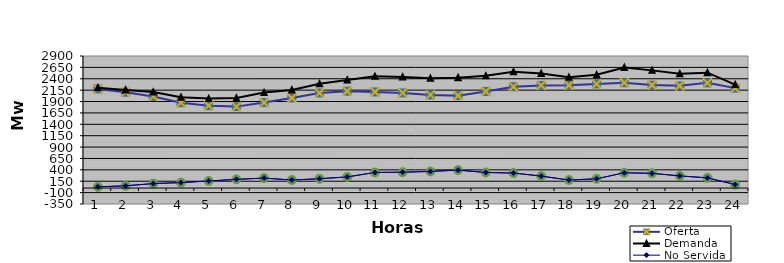
| Category | Oferta | No Servida | Demanda |
|---|---|---|---|
| 1.0 | 2177.19 | 27.155 | 2204.345 |
| 2.0 | 2104.73 | 49.317 | 2154.047 |
| 3.0 | 2012.39 | 98.717 | 2111.107 |
| 4.0 | 1875.26 | 119.951 | 1995.211 |
| 5.0 | 1810.18 | 155.484 | 1965.664 |
| 6.0 | 1788.37 | 191.351 | 1979.721 |
| 7.0 | 1877.43 | 219.229 | 2096.659 |
| 8.0 | 1979.22 | 176.496 | 2155.716 |
| 9.0 | 2087.5 | 204.882 | 2292.382 |
| 10.0 | 2127.69 | 244.719 | 2372.409 |
| 11.0 | 2110.82 | 342.874 | 2453.694 |
| 12.0 | 2089.94 | 348.498 | 2438.438 |
| 13.0 | 2045.32 | 365.266 | 2410.586 |
| 14.0 | 2029.14 | 394.214 | 2423.354 |
| 15.0 | 2121.73 | 342.314 | 2464.044 |
| 16.0 | 2224.94 | 330.265 | 2555.205 |
| 17.0 | 2254.45 | 262.877 | 2517.327 |
| 18.0 | 2257.69 | 175.514 | 2433.204 |
| 19.0 | 2285.84 | 203.353 | 2489.193 |
| 20.0 | 2313.12 | 336.129 | 2649.249 |
| 21.0 | 2260.54 | 323.899 | 2584.439 |
| 22.0 | 2244.49 | 267.043 | 2511.533 |
| 23.0 | 2310.2 | 224.082 | 2534.282 |
| 24.0 | 2194.65 | 77.25 | 2271.9 |